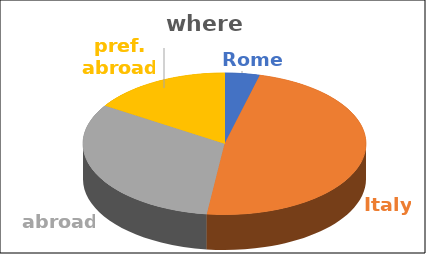
| Category | where | Series 1 | Series 2 | Series 3 | Series 4 |
|---|---|---|---|---|---|
| Rome | 0.04 |  |  |  |  |
| Italy | 0.48 |  |  |  |  |
| abroad | 0.32 |  |  |  |  |
| pref. abroad | 0.16 |  |  |  |  |